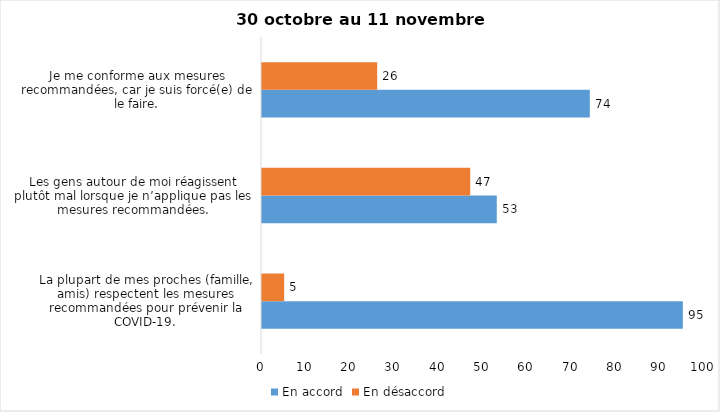
| Category | En accord | En désaccord |
|---|---|---|
| La plupart de mes proches (famille, amis) respectent les mesures recommandées pour prévenir la COVID-19. | 95 | 5 |
| Les gens autour de moi réagissent plutôt mal lorsque je n’applique pas les mesures recommandées. | 53 | 47 |
| Je me conforme aux mesures recommandées, car je suis forcé(e) de le faire. | 74 | 26 |